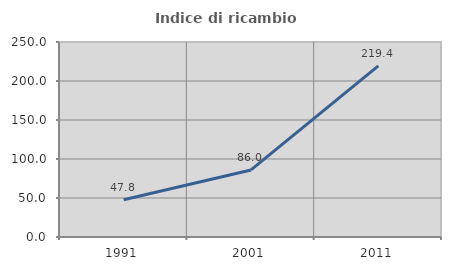
| Category | Indice di ricambio occupazionale  |
|---|---|
| 1991.0 | 47.802 |
| 2001.0 | 85.992 |
| 2011.0 | 219.381 |